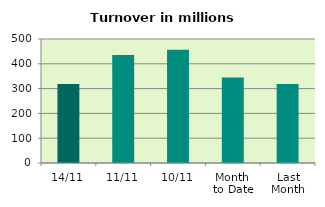
| Category | Series 0 |
|---|---|
| 14/11 | 318.177 |
| 11/11 | 435.78 |
| 10/11 | 456.431 |
| Month 
to Date | 344.827 |
| Last
Month | 318.176 |